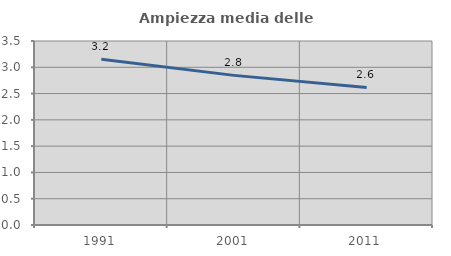
| Category | Ampiezza media delle famiglie |
|---|---|
| 1991.0 | 3.152 |
| 2001.0 | 2.846 |
| 2011.0 | 2.617 |